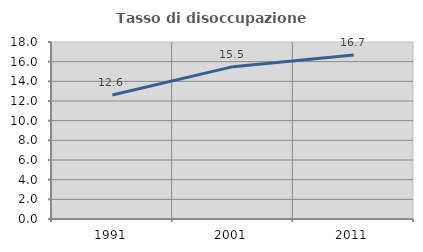
| Category | Tasso di disoccupazione giovanile  |
|---|---|
| 1991.0 | 12.613 |
| 2001.0 | 15.493 |
| 2011.0 | 16.667 |